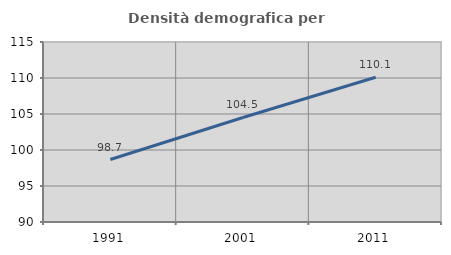
| Category | Densità demografica |
|---|---|
| 1991.0 | 98.677 |
| 2001.0 | 104.519 |
| 2011.0 | 110.097 |